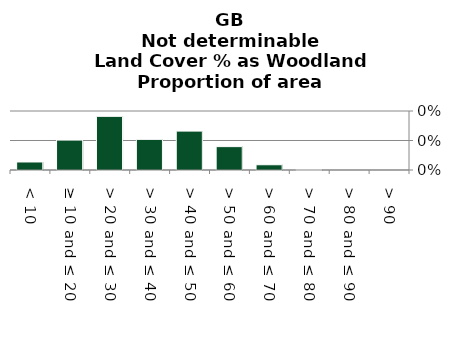
| Category | Not determinable |
|---|---|
|  < 10 | 0 |
|  ≥ 10 and ≤ 20 | 0.001 |
|  > 20 and ≤ 30 | 0.002 |
|  > 30 and ≤ 40 | 0.001 |
|  > 40 and ≤ 50 | 0.001 |
|  > 50 and ≤ 60 | 0.001 |
|  > 60 and ≤ 70 | 0 |
|  > 70 and ≤ 80 | 0 |
|  > 80 and ≤ 90 | 0 |
|  > 90 | 0 |